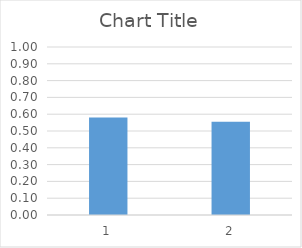
| Category | Series 0 |
|---|---|
| 0 | 0.58 |
| 1 | 0.556 |